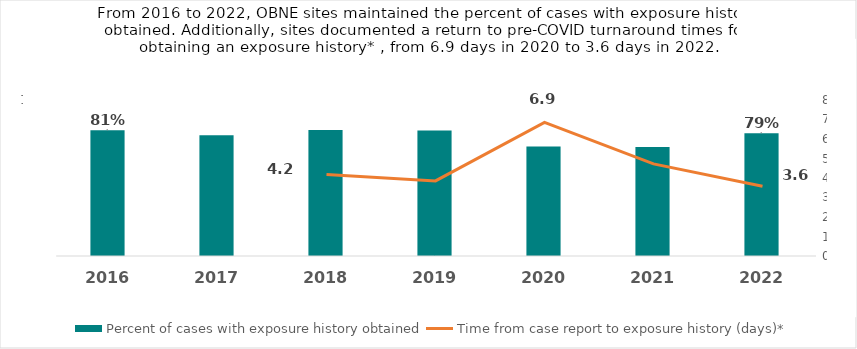
| Category | Percent of cases with exposure history obtained  |
|---|---|
| 2016.0 | 80.53 |
| 2017.0 | 77.333 |
| 2018.0 | 80.73 |
| 2019.0 | 80.42 |
| 2020.0 | 70.186 |
| 2021.0 | 69.845 |
| 2022.0 | 78.659 |